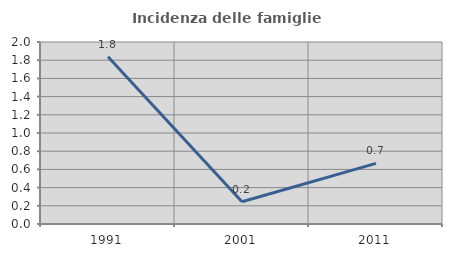
| Category | Incidenza delle famiglie numerose |
|---|---|
| 1991.0 | 1.837 |
| 2001.0 | 0.244 |
| 2011.0 | 0.667 |